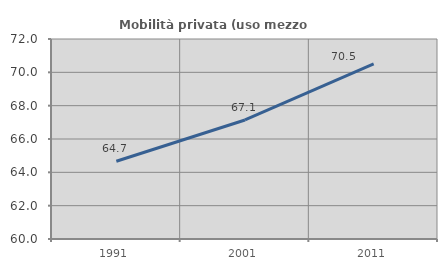
| Category | Mobilità privata (uso mezzo privato) |
|---|---|
| 1991.0 | 64.667 |
| 2001.0 | 67.143 |
| 2011.0 | 70.513 |